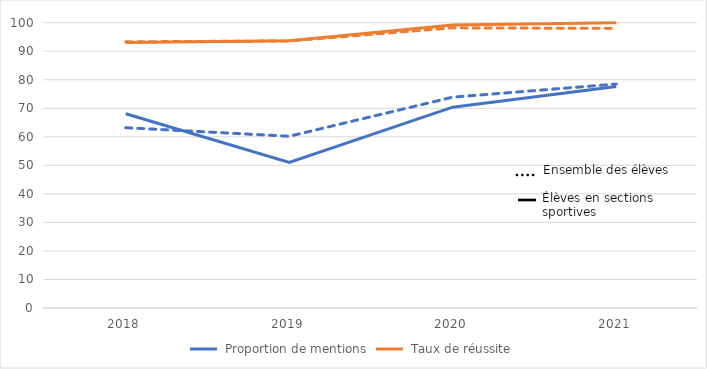
| Category | Series 0 | Series 1 | Ensemble |
|---|---|---|---|
| 2018.0 | 68.1 | 93.1 | 93.3 |
| 2019.0 | 51 | 93.7 | 93.6 |
| 2020.0 | 70.4 | 99.2 | 98.2 |
| 2021.0 | 77.6 | 100 | 98 |